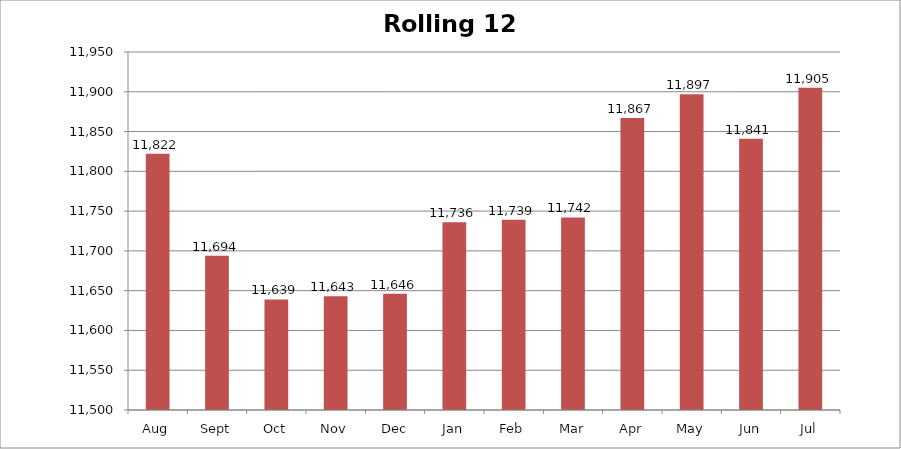
| Category | Rolling 12 Month |
|---|---|
| Aug | 11822 |
| Sept | 11694 |
| Oct | 11639 |
| Nov | 11643 |
| Dec | 11646 |
| Jan | 11736 |
| Feb | 11739 |
| Mar | 11742 |
| Apr | 11867 |
| May | 11897 |
| Jun | 11841 |
| Jul | 11905 |